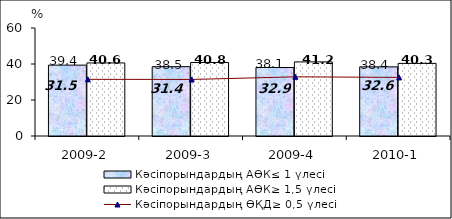
| Category | Кәсіпорындардың АӨК≤ 1 үлесі | Кәсіпорындардың АӨК≥ 1,5 үлесі |
|---|---|---|
| 2009-2 | 39.37 | 40.59 |
| 2009-3 | 38.52 | 40.84 |
| 2009-4 | 38.06 | 41.17 |
| 2010-1 | 38.42 | 40.34 |